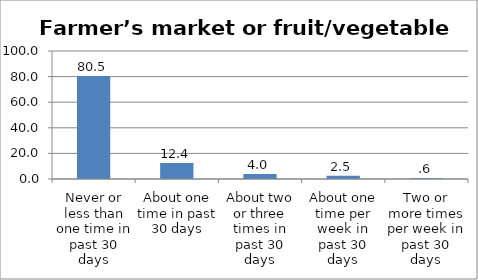
| Category | Series 0 |
|---|---|
| Never or less than one time in past 30 days | 80.529 |
| About one time in past 30 days | 12.424 |
| About two or three times in past 30 days | 3.97 |
| About one time per week in past 30 days | 2.513 |
| Two or more times per week in past 30 days | 0.564 |